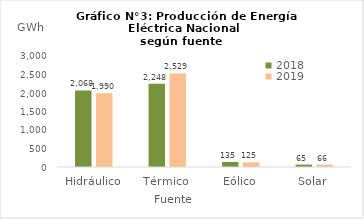
| Category | 2018 | 2019 |
|---|---|---|
| Hidráulico | 2068.267 | 1990.482 |
| Térmico | 2247.552 | 2528.915 |
| Eólico | 135.086 | 124.757 |
| Solar | 65.068 | 66.063 |